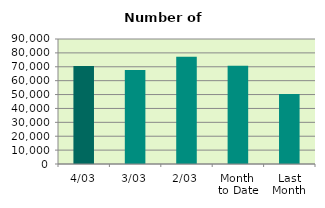
| Category | Series 0 |
|---|---|
| 4/03 | 70576 |
| 3/03 | 67686 |
| 2/03 | 77154 |
| Month 
to Date | 70651.5 |
| Last
Month | 50484.7 |